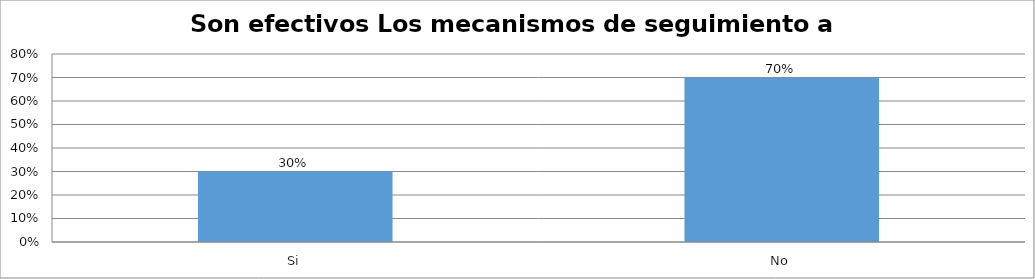
| Category | Series 0 |
|---|---|
| Si | 0.3 |
| No | 0.7 |